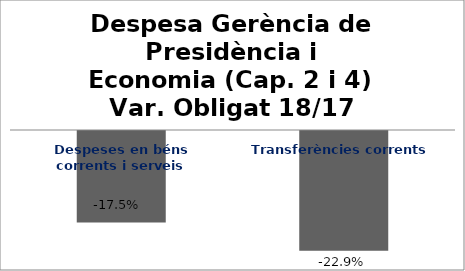
| Category | Series 0 |
|---|---|
| Despeses en béns corrents i serveis | -0.175 |
| Transferències corrents | -0.229 |